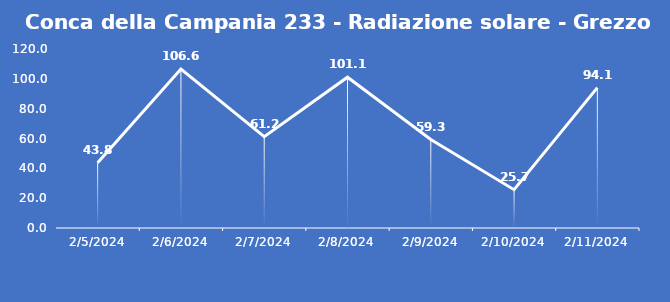
| Category | Conca della Campania 233 - Radiazione solare - Grezzo (W/m2) |
|---|---|
| 2/5/24 | 43.8 |
| 2/6/24 | 106.6 |
| 2/7/24 | 61.2 |
| 2/8/24 | 101.1 |
| 2/9/24 | 59.3 |
| 2/10/24 | 25.7 |
| 2/11/24 | 94.1 |